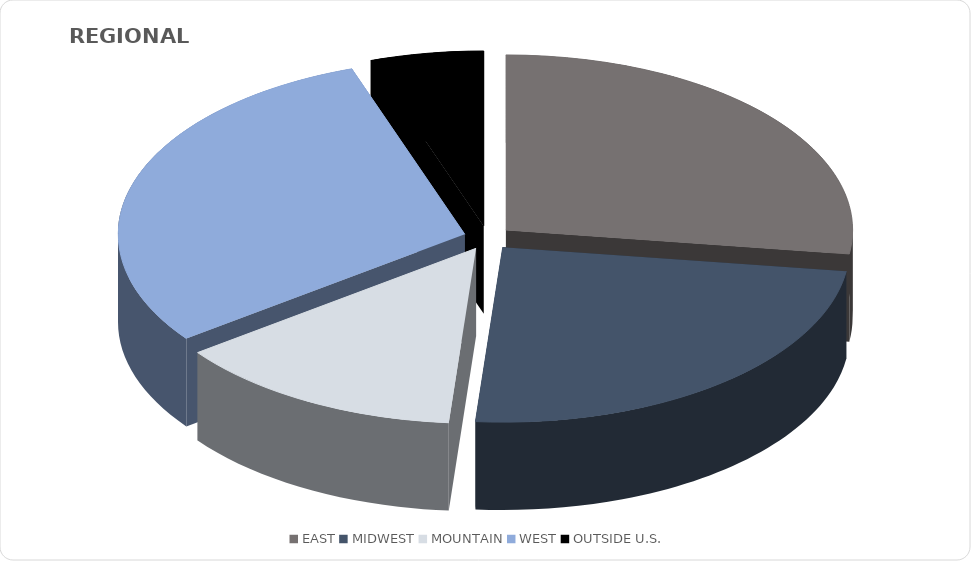
| Category | Series 0 |
|---|---|
| EAST | 1582849 |
| MIDWEST | 1400591 |
| MOUNTAIN | 790619 |
| WEST | 1739189 |
| OUTSIDE U.S. | 307533 |